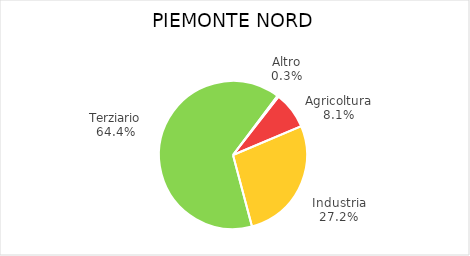
| Category | Piemonte Nord |
|---|---|
| Agricoltura | 6798 |
| Industria | 22916 |
| Terziario | 54183 |
| Altro | 248 |